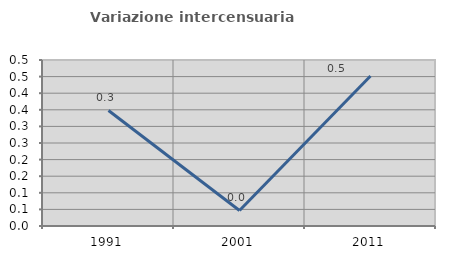
| Category | Variazione intercensuaria annua |
|---|---|
| 1991.0 | 0.348 |
| 2001.0 | 0.047 |
| 2011.0 | 0.452 |